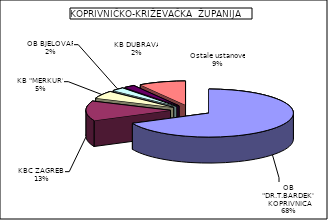
| Category | Series 0 |
|---|---|
| OB "DR.T.BARDEK" KOPRIVNICA | 68.009 |
| KBC ZAGREB  | 13.297 |
| KB "MERKUR" | 5.157 |
| OB BJELOVAR | 2.465 |
| KB DUBRAVA | 2.092 |
| Ostale ustanove | 8.98 |